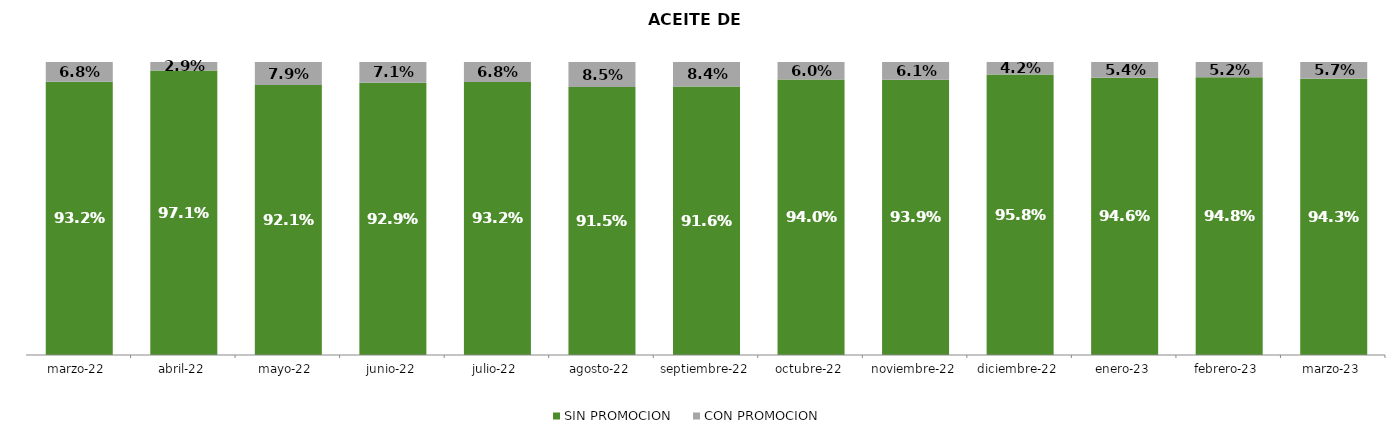
| Category | SIN PROMOCION   | CON PROMOCION   |
|---|---|---|
| 2022-03-01 | 0.932 | 0.068 |
| 2022-04-01 | 0.971 | 0.029 |
| 2022-05-01 | 0.921 | 0.079 |
| 2022-06-01 | 0.929 | 0.071 |
| 2022-07-01 | 0.932 | 0.068 |
| 2022-08-01 | 0.915 | 0.085 |
| 2022-09-01 | 0.916 | 0.084 |
| 2022-10-01 | 0.94 | 0.06 |
| 2022-11-01 | 0.939 | 0.061 |
| 2022-12-01 | 0.958 | 0.042 |
| 2023-01-01 | 0.946 | 0.054 |
| 2023-02-01 | 0.948 | 0.052 |
| 2023-03-01 | 0.943 | 0.057 |